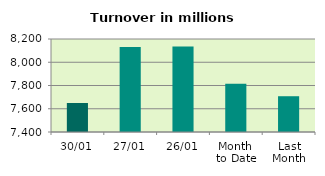
| Category | Series 0 |
|---|---|
| 30/01 | 7649.594 |
| 27/01 | 8130.806 |
| 26/01 | 8134.5 |
| Month 
to Date | 7815.224 |
| Last
Month | 7707.734 |